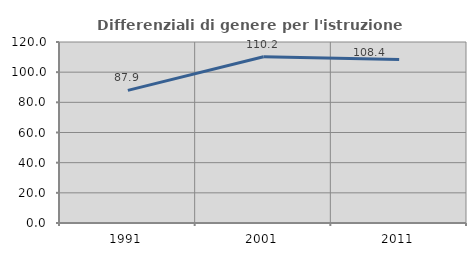
| Category | Differenziali di genere per l'istruzione superiore |
|---|---|
| 1991.0 | 87.939 |
| 2001.0 | 110.223 |
| 2011.0 | 108.403 |